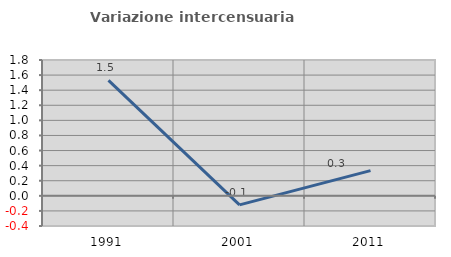
| Category | Variazione intercensuaria annua |
|---|---|
| 1991.0 | 1.53 |
| 2001.0 | -0.12 |
| 2011.0 | 0.334 |